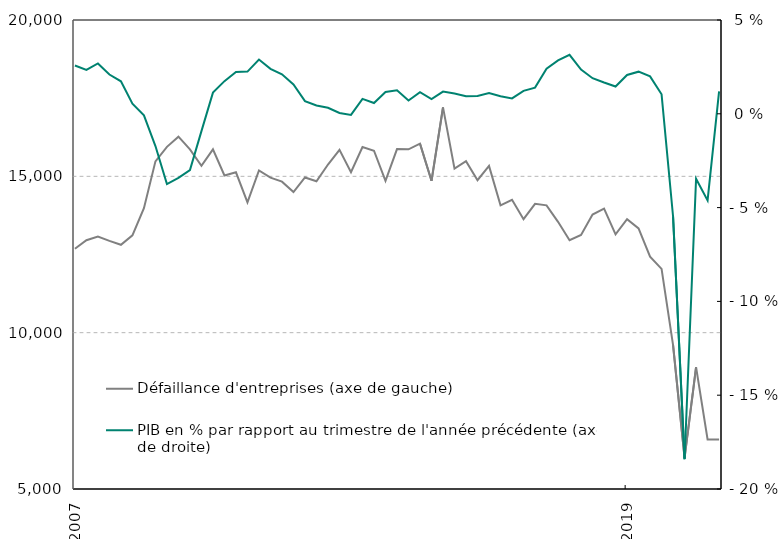
| Category | Défaillance d'entreprises (axe de gauche) |
|---|---|
| 2021-03-01 | 6586 |
| 2020-12-01 | 6583 |
| 2020-09-01 | 8899 |
| 2020-06-01 | 5994 |
| 2020-03-01 | 9599 |
| 2019-12-01 | 12039 |
| 2019-09-01 | 12433 |
| 2019-06-01 | 13332 |
| 2019-03-01 | 13629 |
| 2018-12-01 | 13143 |
| 2018-09-01 | 13969 |
| 2018-06-01 | 13778 |
| 2018-03-01 | 13125 |
| 2017-12-01 | 12955 |
| 2017-09-01 | 13545 |
| 2017-06-01 | 14072 |
| 2017-03-01 | 14120 |
| 2016-12-01 | 13631 |
| 2016-09-01 | 14251 |
| 2016-06-01 | 14072 |
| 2016-03-01 | 15331 |
| 2015-12-01 | 14877 |
| 2015-09-01 | 15485 |
| 2015-06-01 | 15247 |
| 2015-03-01 | 17205 |
| 2014-12-01 | 14857 |
| 2014-09-01 | 16043 |
| 2014-06-01 | 15863 |
| 2014-03-01 | 15873 |
| 2013-12-01 | 14857 |
| 2013-09-01 | 15819 |
| 2013-06-01 | 15937 |
| 2013-03-01 | 15132 |
| 2012-12-01 | 15847 |
| 2012-09-01 | 15378 |
| 2012-06-01 | 14844 |
| 2012-03-01 | 14964 |
| 2011-12-01 | 14499 |
| 2011-09-01 | 14830 |
| 2011-06-01 | 14956 |
| 2011-03-01 | 15188 |
| 2010-12-01 | 14166 |
| 2010-09-01 | 15130 |
| 2010-06-01 | 15028 |
| 2010-03-01 | 15862 |
| 2009-12-01 | 15338 |
| 2009-09-01 | 15862 |
| 2009-06-01 | 16268 |
| 2009-03-01 | 15944 |
| 2008-12-01 | 15479 |
| 2008-09-01 | 13979 |
| 2008-06-01 | 13112 |
| 2008-03-01 | 12811 |
| 2007-12-01 | 12935 |
| 2007-09-01 | 13074 |
| 2007-06-01 | 12957 |
| 2007-03-01 | 12682 |